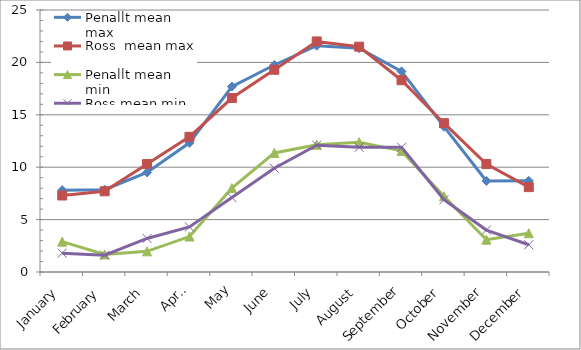
| Category | Penallt mean max | Ross  mean max | Penallt mean min | Ross mean min |
|---|---|---|---|---|
| January | 7.81 | 7.3 | 2.897 | 1.8 |
| February | 7.859 | 7.7 | 1.679 | 1.6 |
| March | 9.5 | 10.3 | 1.971 | 3.2 |
| April | 12.327 | 12.9 | 3.383 | 4.3 |
| May | 17.69 | 16.6 | 8.006 | 7.1 |
| June | 19.753 | 19.3 | 11.363 | 9.9 |
| July | 21.597 | 22 | 12.143 | 12.1 |
| August | 21.353 | 21.5 | 12.387 | 11.9 |
| September | 19.14 | 18.3 | 11.557 | 11.9 |
| October | 13.865 | 14.2 | 7.226 | 6.9 |
| November | 8.69 | 10.3 | 3.083 | 4 |
| December | 8.7 | 8.1 | 3.7 | 2.6 |